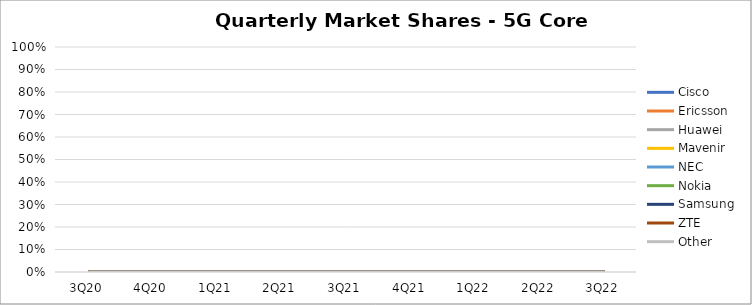
| Category | Cisco | Ericsson | Huawei | Mavenir | NEC | Nokia | Samsung | ZTE | Other |
|---|---|---|---|---|---|---|---|---|---|
| 3Q20 | 0 | 0 | 0 | 0 | 0 | 0 | 0 | 0 | 0 |
| 4Q20 | 0 | 0 | 0 | 0 | 0 | 0 | 0 | 0 | 0 |
| 1Q21 | 0 | 0 | 0 | 0 | 0 | 0 | 0 | 0 | 0 |
| 2Q21 | 0 | 0 | 0 | 0 | 0 | 0 | 0 | 0 | 0 |
| 3Q21 | 0 | 0 | 0 | 0 | 0 | 0 | 0 | 0 | 0 |
| 4Q21 | 0 | 0 | 0 | 0 | 0 | 0 | 0 | 0 | 0 |
| 1Q22 | 0 | 0 | 0 | 0 | 0 | 0 | 0 | 0 | 0 |
| 2Q22 | 0 | 0 | 0 | 0 | 0 | 0 | 0 | 0 | 0 |
| 3Q22 | 0 | 0 | 0 | 0 | 0 | 0 | 0 | 0 | 0 |